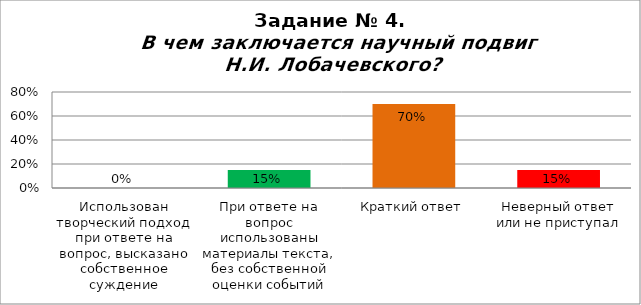
| Category | В чем заключается научный подвиг Н.И. Лобачевского? |
|---|---|
| Использован творческий подход при ответе на вопрос, высказано собственное суждение | 0 |
| При ответе на вопрос использованы материалы текста, без собственной оценки событий | 0.15 |
| Краткий ответ | 0.7 |
| Неверный ответ или не приступал | 0.15 |